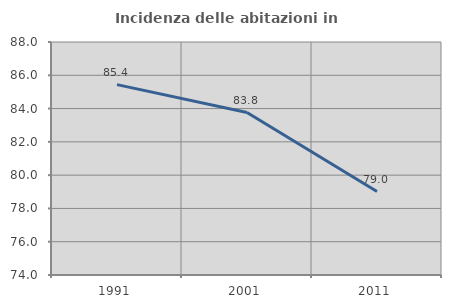
| Category | Incidenza delle abitazioni in proprietà  |
|---|---|
| 1991.0 | 85.439 |
| 2001.0 | 83.762 |
| 2011.0 | 79.015 |